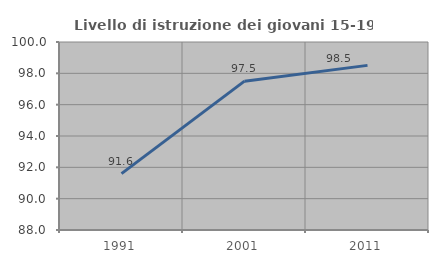
| Category | Livello di istruzione dei giovani 15-19 anni |
|---|---|
| 1991.0 | 91.6 |
| 2001.0 | 97.5 |
| 2011.0 | 98.507 |